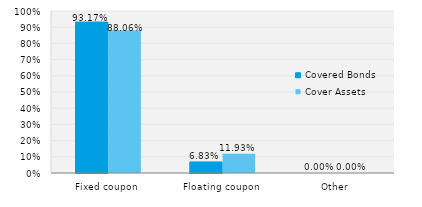
| Category | Covered Bonds | Cover Assets |
|---|---|---|
| Fixed coupon | 0.932 | 0.881 |
| Floating coupon | 0.068 | 0.119 |
| Other | 0 | 0 |